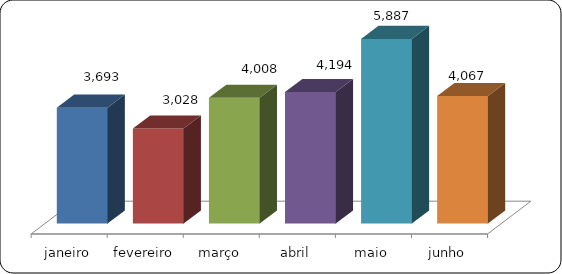
| Category | Series 0 |
|---|---|
| janeiro | 3693 |
| fevereiro | 3028 |
| março | 4008 |
| abril | 4194 |
| maio | 5887 |
| junho | 4067 |